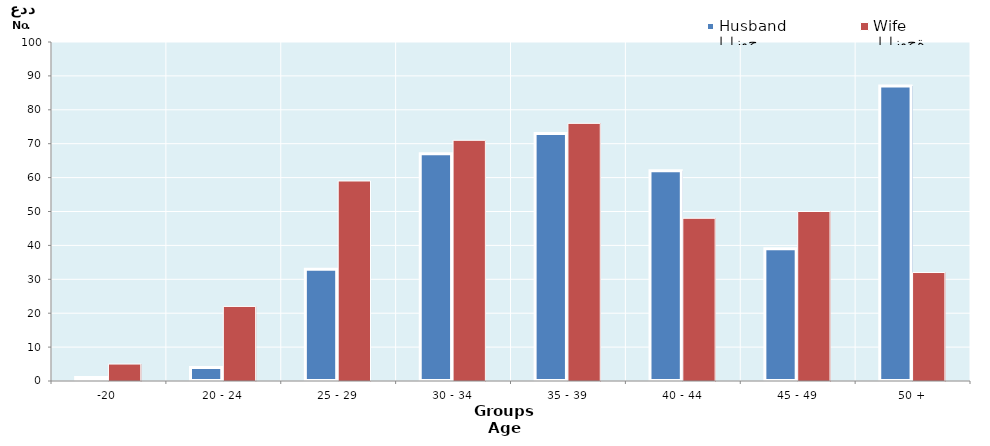
| Category | الزوج
Husband |  الزوجة
Wife |
|---|---|---|
| -20 | 1 | 5 |
| 20 - 24 | 4 | 22 |
| 25 - 29 | 33 | 59 |
| 30 - 34 | 67 | 71 |
| 35 - 39 | 73 | 76 |
| 40 - 44 | 62 | 48 |
| 45 - 49 | 39 | 50 |
| 50 + | 87 | 32 |